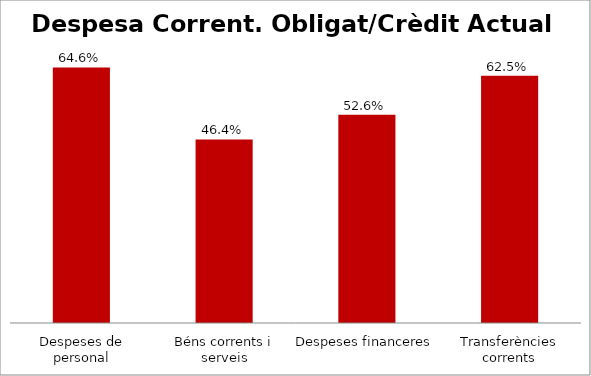
| Category | Series 0 |
|---|---|
| Despeses de personal | 0.646 |
| Béns corrents i serveis | 0.464 |
| Despeses financeres | 0.526 |
| Transferències corrents | 0.625 |